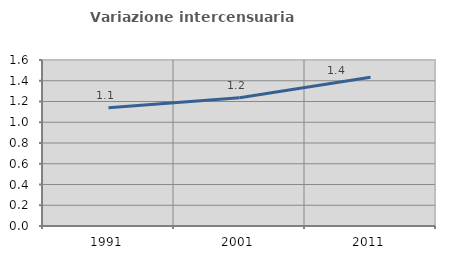
| Category | Variazione intercensuaria annua |
|---|---|
| 1991.0 | 1.14 |
| 2001.0 | 1.236 |
| 2011.0 | 1.433 |